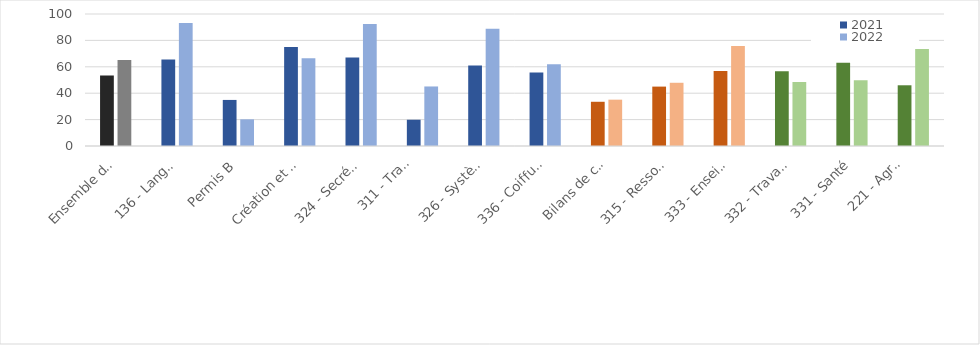
| Category | 2021 | 2022 |
|---|---|---|
| Ensemble des formations | 53.38 | 65.07 |
| 136 - Langues vivantes | 65.5 | 93.1 |
| Permis B | 34.9 | 20.2 |
| Création et reprise d'entreprise | 75 | 66.4 |
| 324 - Secrétariat, bureautique | 67.1 | 92.5 |
| 311 - Transport (hors permis B),
manutention, magasinage | 19.9 | 45.1 |
| 326 - Systèmes d'information | 60.9 | 88.8 |
| 336 - Coiffure, esthétique | 55.6 | 62 |
| Bilans de compétences | 33.5 | 35.1 |
| 315 - Ressources humaines | 45 | 47.9 |
| 333 - Enseignement, formation | 56.9 | 75.8 |
| 332 - Travail social | 56.7 | 48.5 |
| 331 - Santé | 63 | 49.9 |
| 221 - Agroalimentaire,
alimentation, cuisine | 46 | 73.5 |